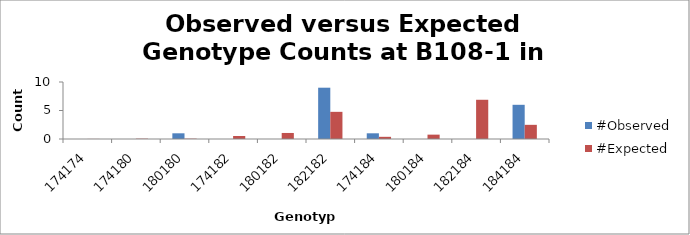
| Category | #Observed | #Expected |
|---|---|---|
| 174174.0 | 0 | 0.015 |
| 174180.0 | 0 | 0.059 |
| 180180.0 | 1 | 0.059 |
| 174182.0 | 0 | 0.529 |
| 180182.0 | 0 | 1.059 |
| 182182.0 | 9 | 4.765 |
| 174184.0 | 1 | 0.382 |
| 180184.0 | 0 | 0.765 |
| 182184.0 | 0 | 6.882 |
| 184184.0 | 6 | 2.485 |